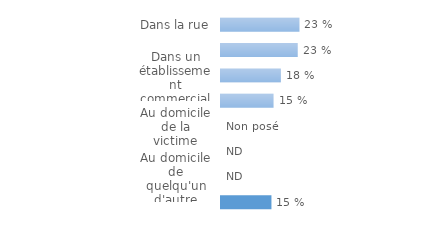
| Category | Series 0 |
|---|---|
| Dans la rue | 0.231 |
| Dans un transport en commun | 0.226 |
| Dans un établissement commercial | 0.176 |
| Sur le lieu de travail ou d'études  | 0.155 |
| Au domicile de la victime | 0 |
| Dans l'immeuble de la victime | 0 |
| Au domicile de quelqu'un d'autre | 0 |
| Dans un autre lieu | 0.148 |